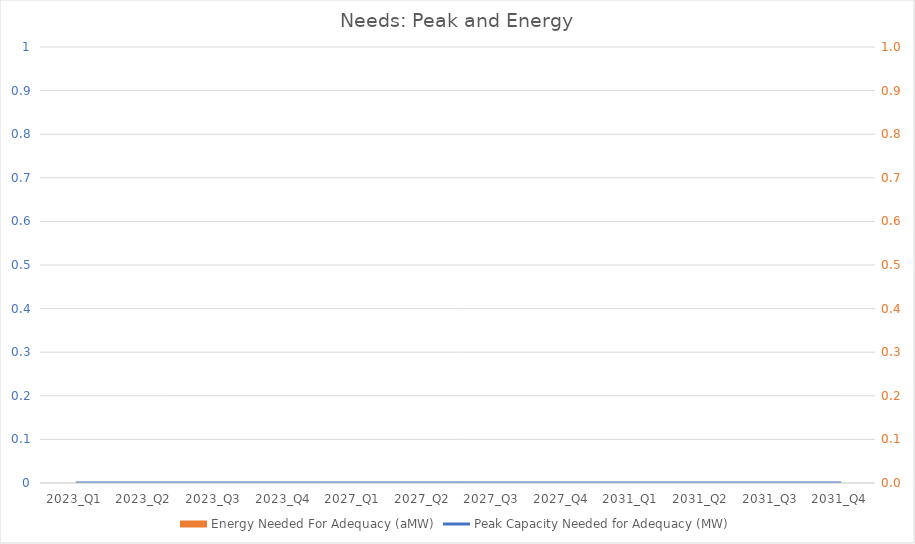
| Category | Energy Needed For Adequacy (aMW) |
|---|---|
| 2023_Q1 | 0 |
| 2023_Q2 | 0 |
| 2023_Q3 | 0 |
| 2023_Q4 | 0 |
| 2027_Q1 | 0 |
| 2027_Q2 | 0 |
| 2027_Q3 | 0 |
| 2027_Q4 | 0 |
| 2031_Q1 | 0 |
| 2031_Q2 | 0 |
| 2031_Q3 | 0 |
| 2031_Q4 | 0 |